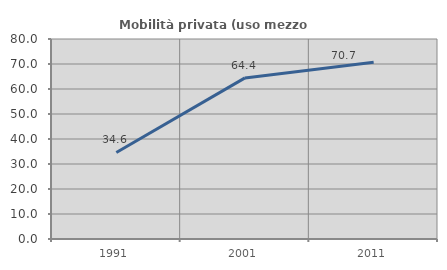
| Category | Mobilità privata (uso mezzo privato) |
|---|---|
| 1991.0 | 34.615 |
| 2001.0 | 64.434 |
| 2011.0 | 70.677 |